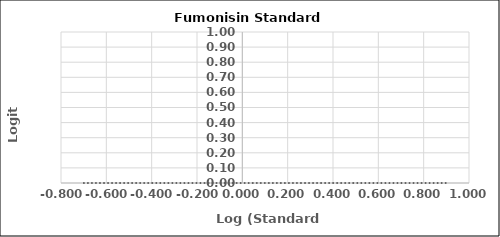
| Category | Series 0 |
|---|---|
| -0.6989700043360187 | 0 |
| -0.2218487496163564 | 0 |
| 0.17609125905568124 | 0 |
| 0.6020599913279624 | 0 |
| 0.9030899869919435 | 0 |